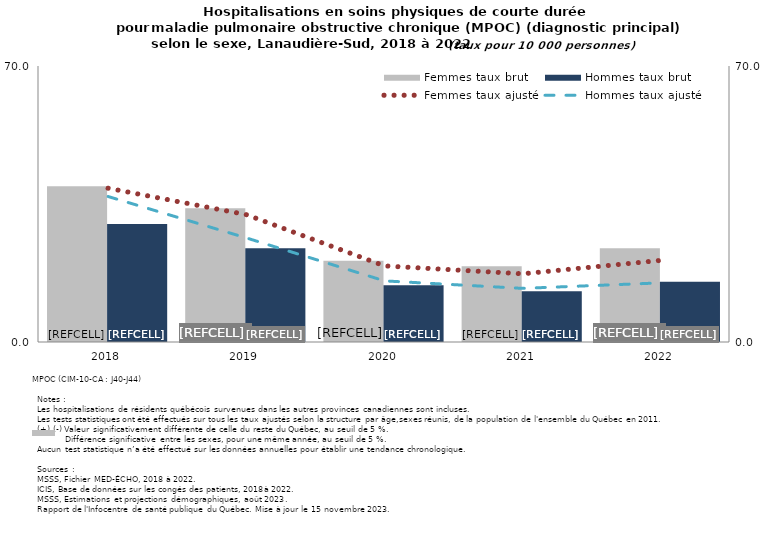
| Category | Femmes taux brut | Hommes taux brut |
|---|---|---|
| 2018.0 | 39.5 | 29.9 |
| 2019.0 | 33.9 | 23.8 |
| 2020.0 | 20.6 | 14.4 |
| 2021.0 | 19.2 | 12.9 |
| 2022.0 | 23.8 | 15.3 |